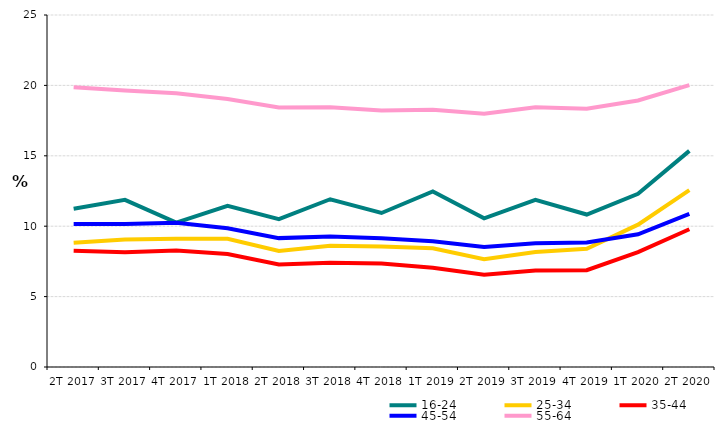
| Category | 16-24 | 25-34 | 35-44 | 45-54 | 55-64 |
|---|---|---|---|---|---|
| 2T 2017 | 11.245 | 8.818 | 8.261 | 10.155 | 19.873 |
| 3T 2017 | 11.868 | 9.048 | 8.145 | 10.148 | 19.633 |
| 4T 2017 | 10.252 | 9.103 | 8.278 | 10.241 | 19.448 |
| 1T 2018 | 11.451 | 9.111 | 8.031 | 9.856 | 19.03 |
| 2T 2018 | 10.502 | 8.242 | 7.284 | 9.153 | 18.424 |
| 3T 2018 | 11.915 | 8.613 | 7.399 | 9.266 | 18.447 |
| 4T 2018 | 10.937 | 8.558 | 7.357 | 9.136 | 18.215 |
| 1T 2019 | 12.471 | 8.427 | 7.049 | 8.938 | 18.266 |
| 2T 2019 | 10.559 | 7.659 | 6.546 | 8.523 | 17.984 |
| 3T 2019 | 11.878 | 8.16 | 6.852 | 8.783 | 18.453 |
| 4T 2019 | 10.829 | 8.392 | 6.875 | 8.845 | 18.335 |
| 1T 2020 | 12.3 | 10.111 | 8.158 | 9.423 | 18.932 |
| 2T 2020 | 15.349 | 12.567 | 9.783 | 10.875 | 20.019 |